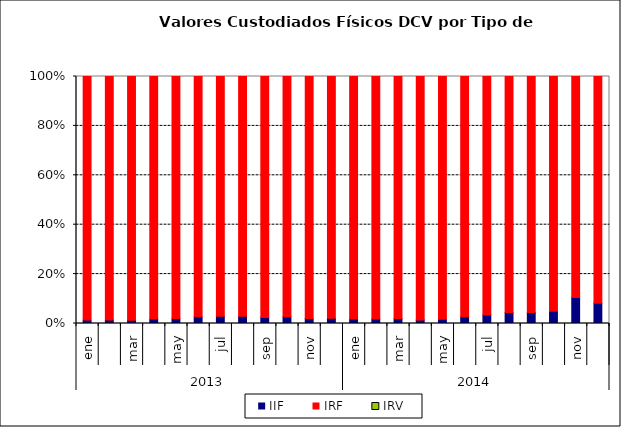
| Category | IIF | IRF | IRV |
|---|---|---|---|
| 0 | 5.08 | 364.889 | 0 |
| 1 | 5.148 | 363.074 | 0 |
| 2 | 4.791 | 360.452 | 0 |
| 3 | 6.578 | 357.548 | 0 |
| 4 | 7.24 | 355.611 | 0 |
| 5 | 9.833 | 352.32 | 0 |
| 6 | 10.319 | 347.126 | 0 |
| 7 | 10.412 | 344.085 | 0 |
| 8 | 8.634 | 340.411 | 0 |
| 9 | 9.402 | 337.233 | 0 |
| 10 | 6.847 | 334.809 | 0 |
| 11 | 7.056 | 330.604 | 0 |
| 12 | 6.204 | 326.158 | 0 |
| 13 | 5.723 | 308.152 | 0 |
| 14 | 6.28 | 306.227 | 0 |
| 15 | 4.489 | 304.405 | 0 |
| 16 | 5.367 | 302.62 | 0 |
| 17 | 8.339 | 298.347 | 0 |
| 18 | 10.581 | 294.237 | 0 |
| 19 | 13.479 | 292.21 | 0 |
| 20 | 13.501 | 289.585 | 0 |
| 21 | 15.113 | 286.64 | 0 |
| 22 | 34.055 | 289.592 | 0 |
| 23 | 25.109 | 280.567 | 0 |